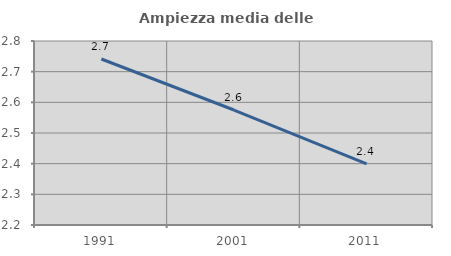
| Category | Ampiezza media delle famiglie |
|---|---|
| 1991.0 | 2.741 |
| 2001.0 | 2.575 |
| 2011.0 | 2.399 |